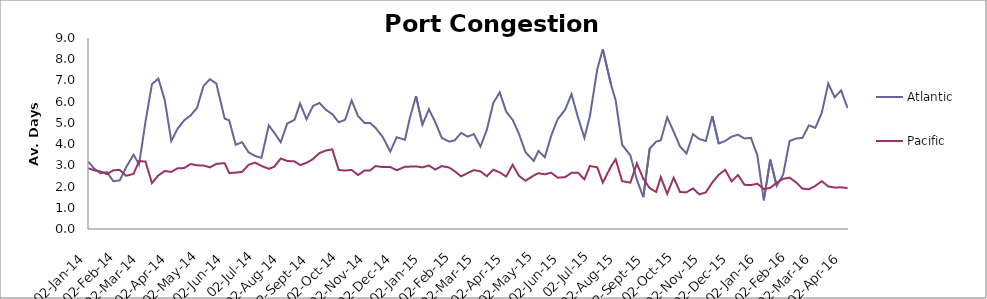
| Category | Atlantic  | Pacific |
|---|---|---|
| 2014-01-02 | 3.167 | 2.863 |
| 2014-01-08 | 2.854 | 2.767 |
| 2014-01-15 | 2.625 | 2.712 |
| 2014-01-22 | 2.688 | 2.582 |
| 2014-01-29 | 2.25 | 2.767 |
| 2014-02-05 | 2.292 | 2.781 |
| 2014-02-12 | 2.917 | 2.507 |
| 2014-02-20 | 3.5 | 2.596 |
| 2014-02-26 | 3.042 | 3.199 |
| 2014-03-05 | 5.059 | 3.178 |
| 2014-03-12 | 6.824 | 2.164 |
| 2014-03-19 | 7.088 | 2.527 |
| 2014-03-26 | 6.059 | 2.733 |
| 2014-04-02 | 4.147 | 2.692 |
| 2014-04-09 | 4.735 | 2.863 |
| 2014-04-16 | 5.118 | 2.87 |
| 2014-04-23 | 5.353 | 3.062 |
| 2014-04-30 | 5.706 | 3 |
| 2014-05-07 | 6.735 | 2.993 |
| 2014-05-14 | 7.059 | 2.904 |
| 2014-05-21 | 6.853 | 3.068 |
| 2014-05-30 | 5.206 | 3.103 |
| 2014-06-04 | 5.118 | 2.637 |
| 2014-06-11 | 3.971 | 2.658 |
| 2014-06-18 | 4.088 | 2.692 |
| 2014-06-25 | 3.618 | 3.021 |
| 2014-07-02 | 3.441 | 3.13 |
| 2014-07-09 | 3.353 | 2.973 |
| 2014-07-17 | 4.882 | 2.836 |
| 2014-07-23 | 4.529 | 2.938 |
| 2014-07-30 | 4.088 | 3.322 |
| 2014-08-06 | 4.971 | 3.205 |
| 2014-08-14 | 5.147 | 3.185 |
| 2014-08-20 | 5.912 | 3.014 |
| 2014-08-27 | 5.176 | 3.116 |
| 2014-09-03 | 5.794 | 3.295 |
| 2014-09-10 | 5.941 | 3.575 |
| 2014-09-17 | 5.618 | 3.699 |
| 2014-09-24 | 5.412 | 3.753 |
| 2014-10-01 | 5.029 | 2.781 |
| 2014-10-08 | 5.147 | 2.753 |
| 2014-10-15 | 6.059 | 2.785 |
| 2014-10-22 | 5.324 | 2.541 |
| 2014-10-29 | 5 | 2.753 |
| 2014-11-04 | 5 | 2.753 |
| 2014-11-10 | 4.765 | 2.966 |
| 2014-11-18 | 4.324 | 2.918 |
| 2014-11-26 | 3.647 | 2.925 |
| 2014-12-03 | 4.324 | 2.767 |
| 2014-12-12 | 4.206 | 2.932 |
| 2014-12-17 | 5.176 | 2.938 |
| 2014-12-24 | 6.265 | 2.952 |
| 2014-12-31 | 4.912 | 2.904 |
| 2015-01-07 | 5.647 | 2.993 |
| 2015-01-14 | 5.029 | 2.801 |
| 2015-01-21 | 4.294 | 2.966 |
| 2015-01-29 | 4.118 | 2.897 |
| 2015-02-04 | 4.176 | 2.726 |
| 2015-02-11 | 4.529 | 2.479 |
| 2015-02-18 | 4.353 | 2.637 |
| 2015-02-25 | 4.471 | 2.774 |
| 2015-03-04 | 3.882 | 2.719 |
| 2015-03-11 | 4.676 | 2.486 |
| 2015-03-18 | 5.941 | 2.795 |
| 2015-03-25 | 6.441 | 2.664 |
| 2015-04-01 | 5.529 | 2.473 |
| 2015-04-08 | 5.147 | 3.027 |
| 2015-04-15 | 4.471 | 2.5 |
| 2015-04-22 | 3.618 | 2.274 |
| 2015-05-01 | 3.206 | 2.521 |
| 2015-05-06 | 3.676 | 2.63 |
| 2015-05-13 | 3.382 | 2.575 |
| 2015-05-20 | 4.412 | 2.651 |
| 2015-05-27 | 5.176 | 2.418 |
| 2015-06-04 | 5.618 | 2.442 |
| 2015-06-11 | 6.353 | 2.645 |
| 2015-06-18 | 5.265 | 2.651 |
| 2015-06-25 | 4.294 | 2.342 |
| 2015-07-01 | 5.324 | 2.973 |
| 2015-07-09 | 7.529 | 2.904 |
| 2015-07-15 | 8.471 | 2.189 |
| 2015-07-24 | 6.794 | 2.952 |
| 2015-07-29 | 6.059 | 3.288 |
| 2015-08-05 | 3.971 | 2.253 |
| 2015-08-14 | 3.471 | 2.185 |
| 2015-08-21 | 2.324 | 3.089 |
| 2015-08-28 | 1.5 | 2.37 |
| 2015-09-04 | 3.794 | 1.925 |
| 2015-09-11 | 4.118 | 1.747 |
| 2015-09-16 | 4.176 | 2.445 |
| 2015-09-23 | 5.265 | 1.658 |
| 2015-09-30 | 4.588 | 2.418 |
| 2015-10-07 | 3.882 | 1.74 |
| 2015-10-14 | 3.559 | 1.733 |
| 2015-10-21 | 4.471 | 1.911 |
| 2015-10-28 | 4.235 | 1.63 |
| 2015-11-04 | 4.147 | 1.726 |
| 2015-11-11 | 5.324 | 2.192 |
| 2015-11-18 | 4.029 | 2.555 |
| 2015-11-25 | 4.147 | 2.788 |
| 2015-12-02 | 4.353 | 2.247 |
| 2015-12-09 | 4.441 | 2.541 |
| 2015-12-16 | 4.265 | 2.082 |
| 2015-12-23 | 4.294 | 2.068 |
| 2015-12-30 | 3.471 | 2.137 |
| 2016-01-06 | 1.353 | 1.884 |
| 2016-01-13 | 3.265 | 1.938 |
| 2016-01-20 | 2.029 | 2.185 |
| 2016-01-27 | 2.559 | 2.363 |
| 2016-02-03 | 4.147 | 2.418 |
| 2016-02-10 | 4.265 | 2.199 |
| 2016-02-17 | 4.294 | 1.904 |
| 2016-02-24 | 4.882 | 1.87 |
| 2016-03-02 | 4.765 | 2.034 |
| 2016-03-09 | 5.471 | 2.253 |
| 2016-03-16 | 6.853 | 2.007 |
| 2016-03-23 | 6.206 | 1.952 |
| 2016-03-30 | 6.529 | 1.966 |
| 2016-04-06 | 5.706 | 1.925 |